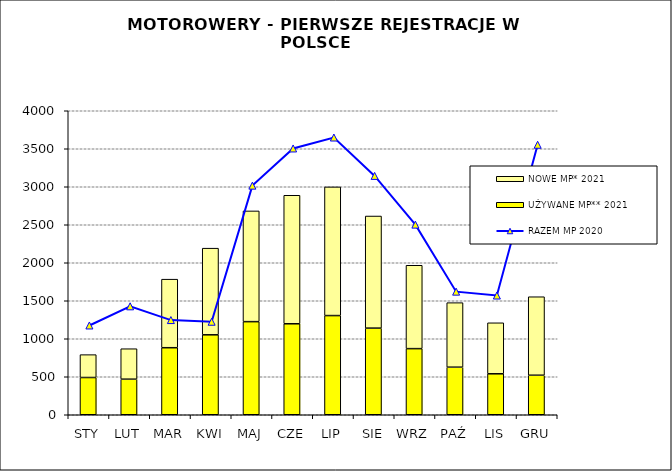
| Category | UŻYWANE MP** 2021 | NOWE MP* 2021 |
|---|---|---|
| STY | 490 | 301 |
| LUT | 468 | 401 |
| MAR | 882 | 902 |
| KWI | 1052 | 1140 |
| MAJ | 1225 | 1457 |
| CZE | 1197 | 1691 |
| LIP | 1305 | 1693 |
| SIE | 1140 | 1475 |
| WRZ | 870 | 1097 |
| PAŹ | 626 | 849 |
| LIS | 539 | 671 |
| GRU | 520 | 1033 |